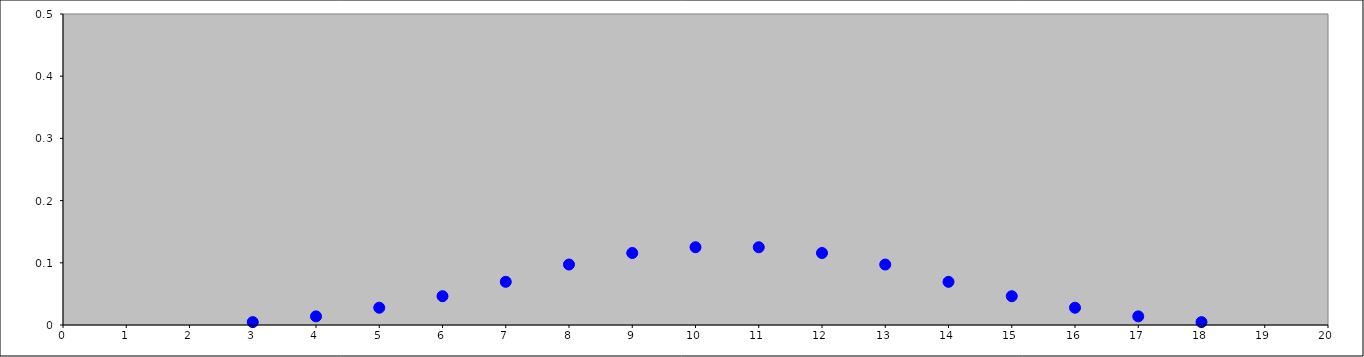
| Category | Series 0 |
|---|---|
| 3.0 | 0.005 |
| 4.0 | 0.014 |
| 5.0 | 0.028 |
| 6.0 | 0.046 |
| 7.0 | 0.069 |
| 8.0 | 0.097 |
| 9.0 | 0.116 |
| 10.0 | 0.125 |
| 11.0 | 0.125 |
| 12.0 | 0.116 |
| 13.0 | 0.097 |
| 14.0 | 0.069 |
| 15.0 | 0.046 |
| 16.0 | 0.028 |
| 17.0 | 0.014 |
| 18.0 | 0.005 |